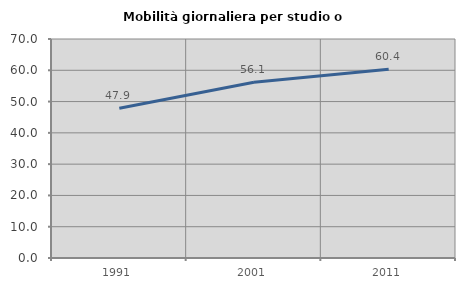
| Category | Mobilità giornaliera per studio o lavoro |
|---|---|
| 1991.0 | 47.856 |
| 2001.0 | 56.149 |
| 2011.0 | 60.366 |